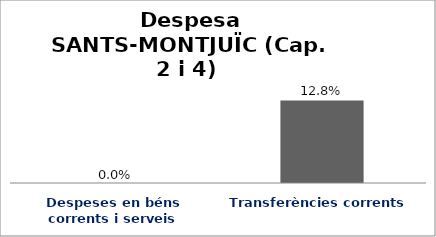
| Category | Series 0 |
|---|---|
| Despeses en béns corrents i serveis | 0 |
| Transferències corrents | 0.128 |